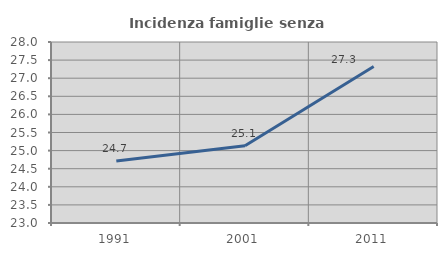
| Category | Incidenza famiglie senza nuclei |
|---|---|
| 1991.0 | 24.713 |
| 2001.0 | 25.137 |
| 2011.0 | 27.322 |